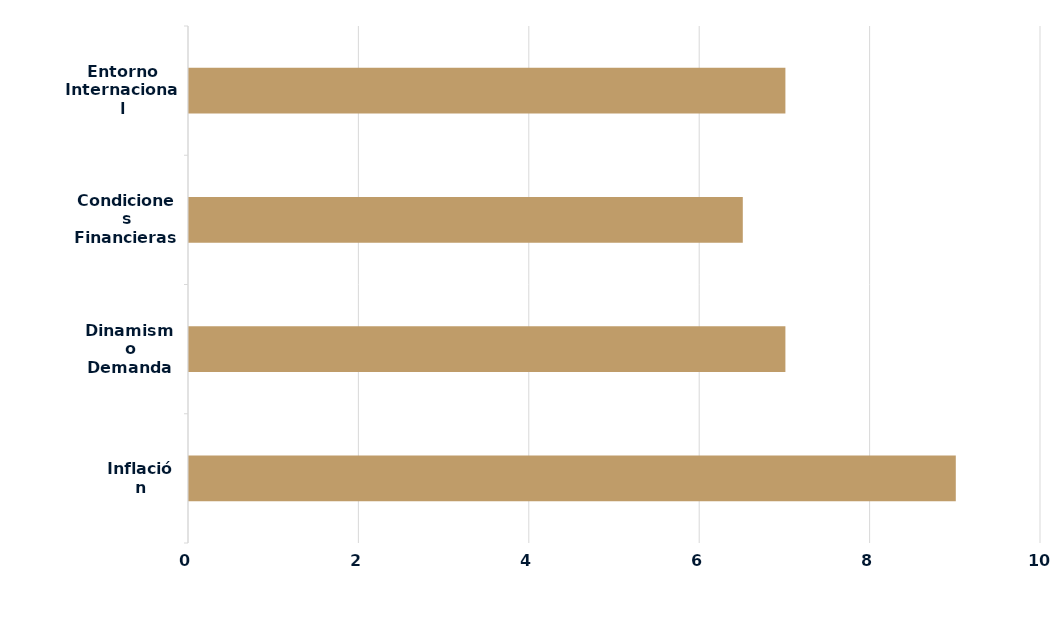
| Category | Series 0 |
|---|---|
| Inflación | 9 |
| Dinamismo Demanda | 7 |
| Condiciones Financieras Locales | 6.5 |
| Entorno Internacional | 7 |